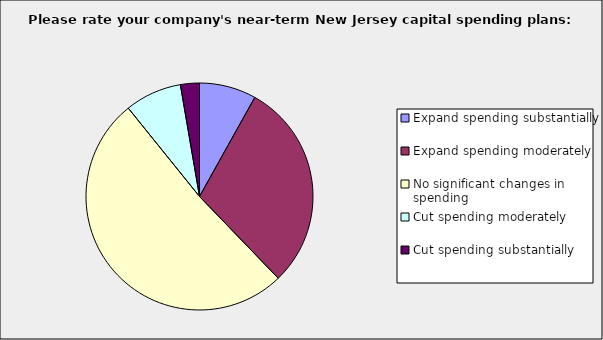
| Category | Series 0 |
|---|---|
| Expand spending substantially | 0.081 |
| Expand spending moderately | 0.297 |
| No significant changes in spending | 0.514 |
| Cut spending moderately | 0.081 |
| Cut spending substantially | 0.027 |